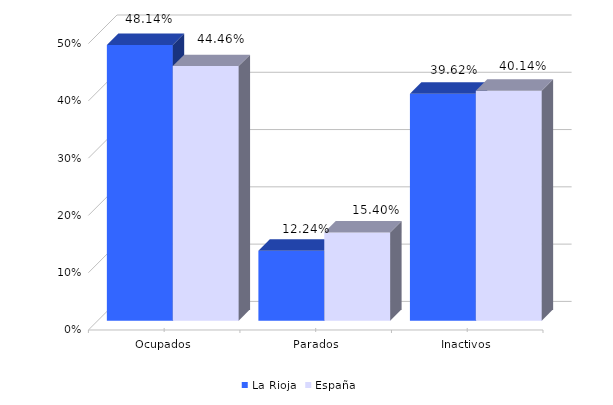
| Category | La Rioja | España |
|---|---|---|
| Ocupados | 0.481 | 0.445 |
| Parados | 0.122 | 0.154 |
| Inactivos | 0.396 | 0.401 |